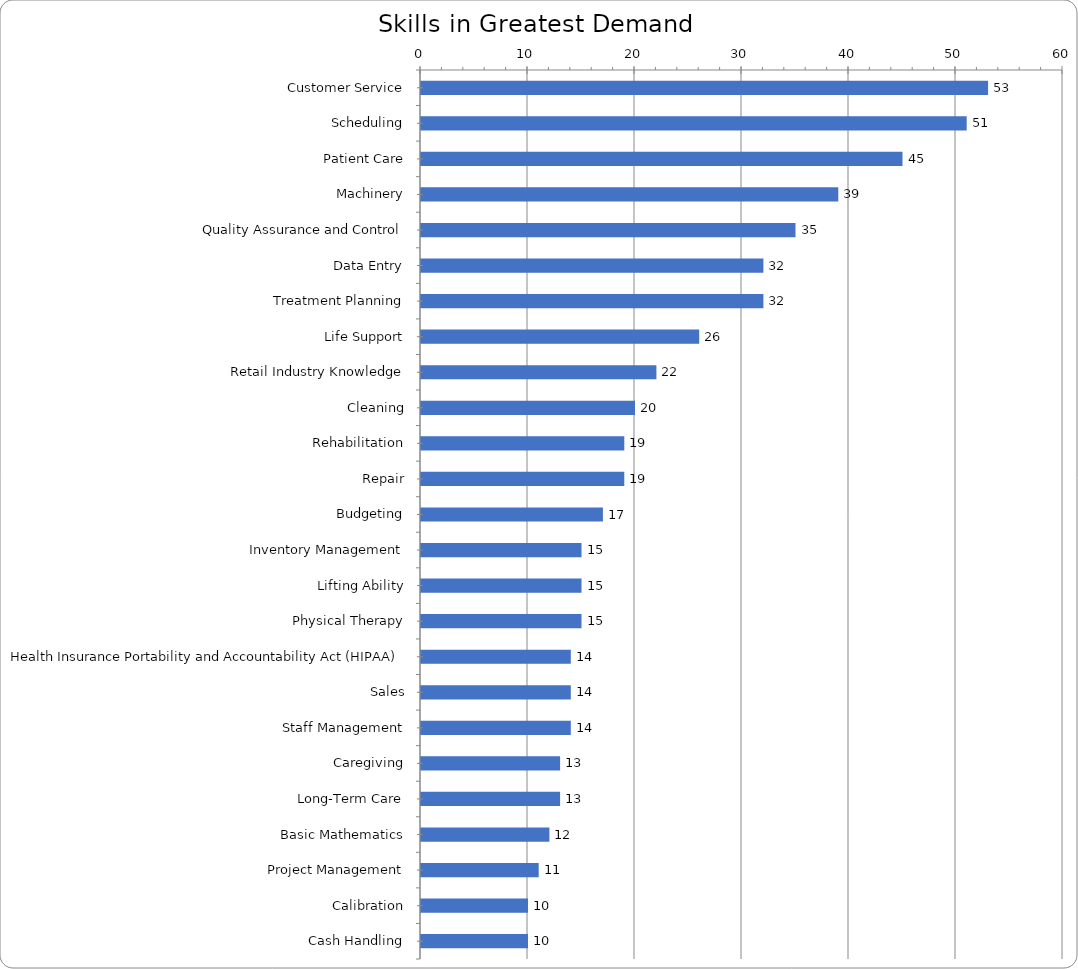
| Category | Series 0 |
|---|---|
| Customer Service | 53 |
| Scheduling | 51 |
| Patient Care | 45 |
| Machinery | 39 |
| Quality Assurance and Control | 35 |
| Data Entry | 32 |
| Treatment Planning | 32 |
| Life Support | 26 |
| Retail Industry Knowledge | 22 |
| Cleaning | 20 |
| Rehabilitation | 19 |
| Repair | 19 |
| Budgeting | 17 |
| Inventory Management | 15 |
| Lifting Ability | 15 |
| Physical Therapy | 15 |
| Health Insurance Portability and Accountability Act (HIPAA) | 14 |
| Sales | 14 |
| Staff Management | 14 |
| Caregiving | 13 |
| Long-Term Care | 13 |
| Basic Mathematics | 12 |
| Project Management | 11 |
| Calibration | 10 |
| Cash Handling | 10 |